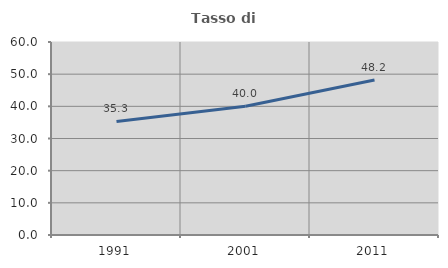
| Category | Tasso di occupazione   |
|---|---|
| 1991.0 | 35.294 |
| 2001.0 | 40 |
| 2011.0 | 48.205 |